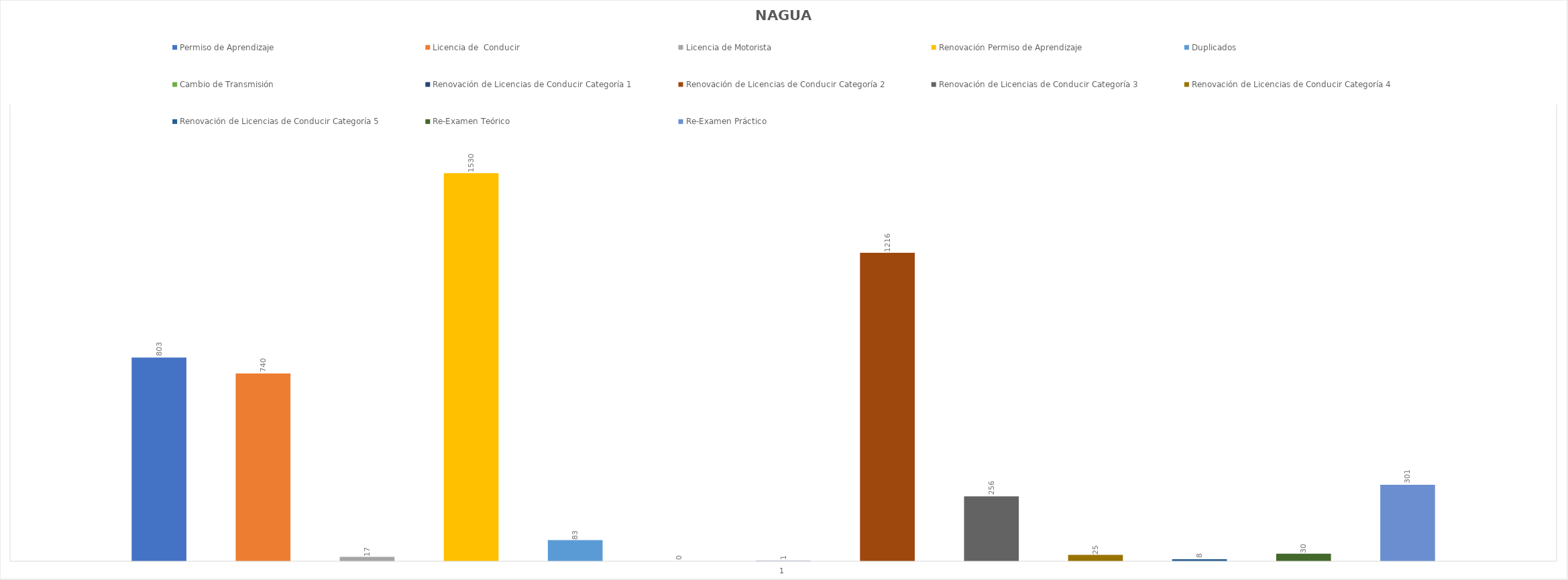
| Category | Permiso de Aprendizaje  | Licencia de  Conducir  | Licencia de Motorista | Renovación Permiso de Aprendizaje | Duplicados  | Cambio de Transmisión  | Renovación de Licencias de Conducir Categoría 1 | Renovación de Licencias de Conducir Categoría 2 | Renovación de Licencias de Conducir Categoría 3 | Renovación de Licencias de Conducir Categoría 4 | Renovación de Licencias de Conducir Categoría 5 | Re-Examen Teórico | Re-Examen Práctico |
|---|---|---|---|---|---|---|---|---|---|---|---|---|---|
| 0 | 803 | 740 | 17 | 1530 | 83 | 0 | 1 | 1216 | 256 | 25 | 8 | 30 | 301 |